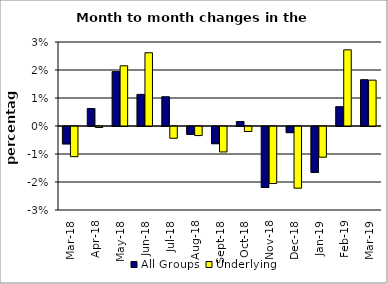
| Category | All Groups | Underlying |
|---|---|---|
| 2018-03-01 | -0.006 | -0.011 |
| 2018-04-01 | 0.006 | 0 |
| 2018-05-01 | 0.019 | 0.021 |
| 2018-06-01 | 0.011 | 0.026 |
| 2018-07-01 | 0.01 | -0.004 |
| 2018-08-01 | -0.003 | -0.003 |
| 2018-09-01 | -0.006 | -0.009 |
| 2018-10-01 | 0.002 | -0.002 |
| 2018-11-01 | -0.022 | -0.02 |
| 2018-12-01 | -0.002 | -0.022 |
| 2019-01-01 | -0.016 | -0.011 |
| 2019-02-01 | 0.007 | 0.027 |
| 2019-03-01 | 0.017 | 0.016 |